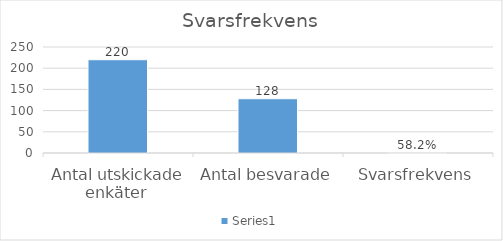
| Category | Series 0 |
|---|---|
| Antal utskickade enkäter  | 220 |
| Antal besvarade | 128 |
| Svarsfrekvens | 0.582 |